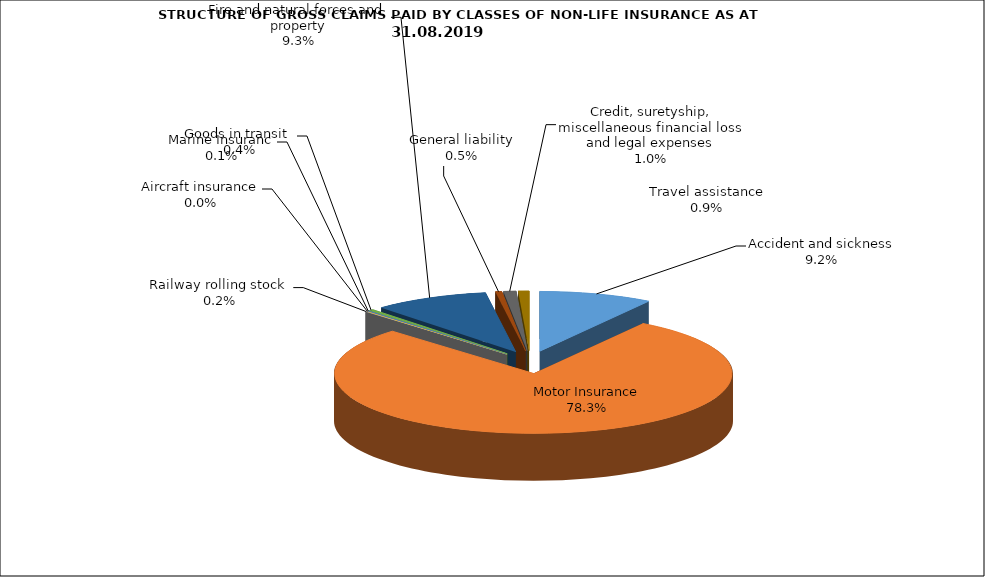
| Category | Accident and sickness | Series 1 |
|---|---|---|
| Accident and sickness | 0.092 |  |
| Motor Insurance | 0.783 |  |
| Railway rolling stock  | 0.002 |  |
| Aircraft insurance | 0 |  |
| Marine Insuranc | 0.001 |  |
| Goods in transit  | 0.004 |  |
| Fire and natural forces and property | 0.093 |  |
| General liability | 0.005 |  |
| Credit, suretyship, miscellaneous financial loss and legal expenses | 0.01 |  |
| Travel assistance | 0.009 |  |